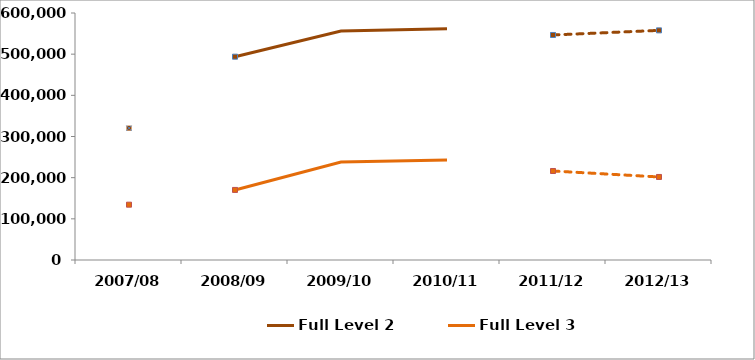
| Category | Full Level 2 | Full Level 3 |
|---|---|---|
| 2007/08 | 320300 | 134400 |
| 2008/09 | 493900 | 170200 |
| 2009/10 | 556000 | 237800 |
| 2010/11 | 561800 | 242700 |
| 2011/12 | 546600 | 216200 |
| 2012/13 | 557800 | 201700 |